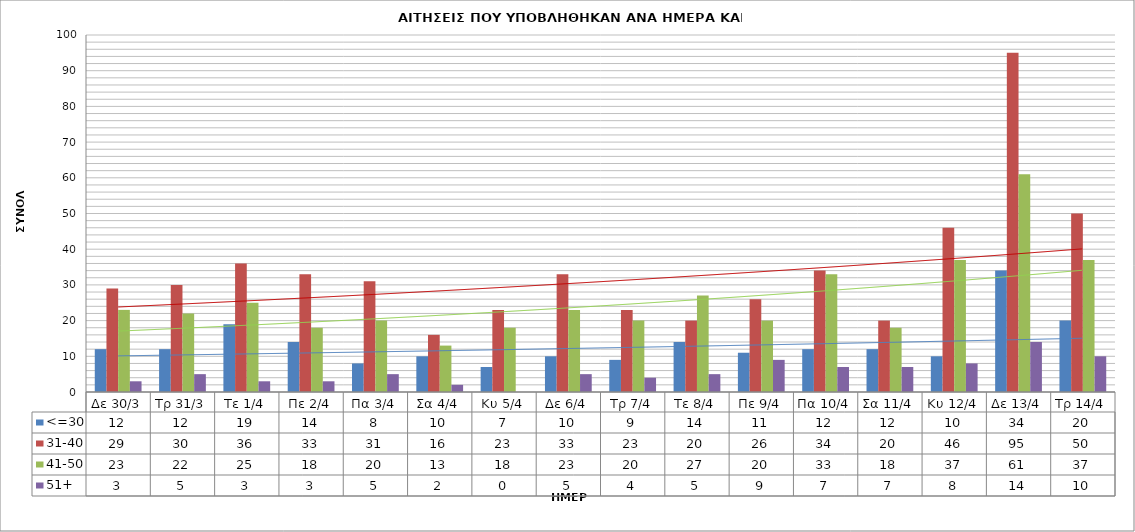
| Category | <=30 | 31-40 | 41-50 | 51+ |
|---|---|---|---|---|
| Δε 30/3 | 12 | 29 | 23 | 3 |
| Τρ 31/3 | 12 | 30 | 22 | 5 |
| Τε 1/4 | 19 | 36 | 25 | 3 |
| Πε 2/4 | 14 | 33 | 18 | 3 |
| Πα 3/4 | 8 | 31 | 20 | 5 |
| Σα 4/4 | 10 | 16 | 13 | 2 |
| Κυ 5/4 | 7 | 23 | 18 | 0 |
| Δε 6/4 | 10 | 33 | 23 | 5 |
| Τρ 7/4 | 9 | 23 | 20 | 4 |
| Τε 8/4 | 14 | 20 | 27 | 5 |
| Πε 9/4 | 11 | 26 | 20 | 9 |
| Πα 10/4 | 12 | 34 | 33 | 7 |
| Σα 11/4 | 12 | 20 | 18 | 7 |
| Κυ 12/4 | 10 | 46 | 37 | 8 |
| Δε 13/4 | 34 | 95 | 61 | 14 |
| Τρ 14/4 | 20 | 50 | 37 | 10 |